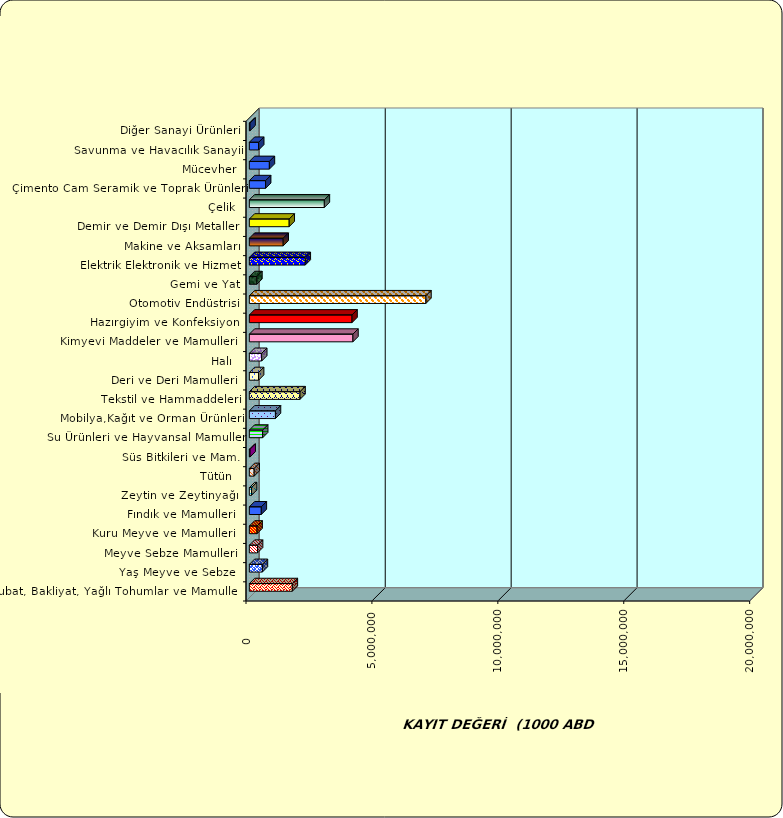
| Category | Series 0 |
|---|---|
|  Hububat, Bakliyat, Yağlı Tohumlar ve Mamulleri  | 1705872.122 |
|  Yaş Meyve ve Sebze   | 518206.103 |
|  Meyve Sebze Mamulleri  | 325039.998 |
|  Kuru Meyve ve Mamulleri   | 306205.626 |
|  Fındık ve Mamulleri  | 474454.771 |
|  Zeytin ve Zeytinyağı  | 85908.525 |
|  Tütün  | 191923.594 |
|  Süs Bitkileri ve Mam. | 30717.143 |
|  Su Ürünleri ve Hayvansal Mamuller | 528586.699 |
|  Mobilya,Kağıt ve Orman Ürünleri | 1036310.139 |
|  Tekstil ve Hammaddeleri | 2012192.196 |
|  Deri ve Deri Mamulleri  | 366910.829 |
|  Halı  | 491008.017 |
|  Kimyevi Maddeler ve Mamulleri   | 4112775.213 |
|  Hazırgiyim ve Konfeksiyon  | 4076705.271 |
|  Otomotiv Endüstrisi | 7011763.259 |
|  Gemi ve Yat | 298671.717 |
|  Elektrik Elektronik ve Hizmet | 2220164.458 |
|  Makine ve Aksamları | 1344044.928 |
|  Demir ve Demir Dışı Metaller  | 1582488.538 |
|  Çelik | 2977979.963 |
|  Çimento Cam Seramik ve Toprak Ürünleri | 645234.828 |
|  Mücevher | 795430.323 |
|  Savunma ve Havacılık Sanayii | 370274.044 |
|  Diğer Sanayi Ürünleri | 27604.487 |